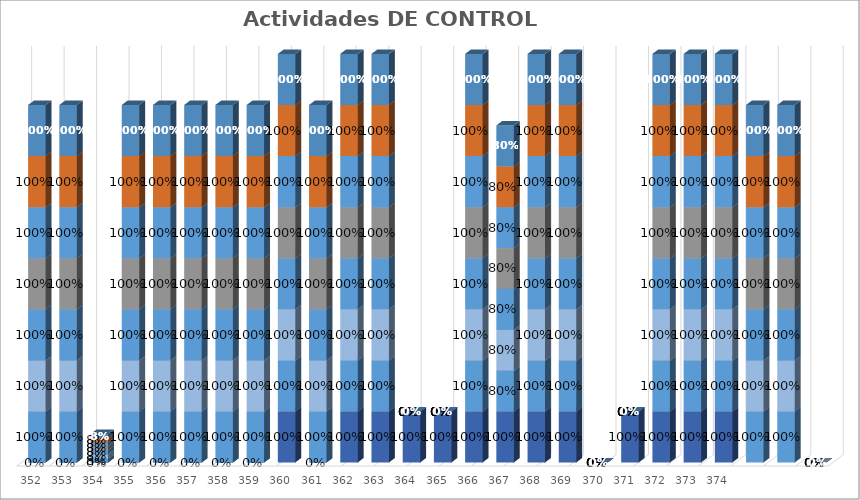
| Category | % Avance |
|---|---|
| 352.0 | 1 |
| 353.0 | 1 |
| 354.0 | 0.08 |
| 355.0 | 1 |
| 356.0 | 1 |
| 357.0 | 1 |
| 358.0 | 1 |
| 359.0 | 1 |
| 360.0 | 1 |
| 361.0 | 1 |
| 362.0 | 1 |
| 363.0 | 1 |
| 364.0 | 0 |
| 365.0 | 0 |
| 366.0 | 1 |
| 367.0 | 0.8 |
| 368.0 | 1 |
| 369.0 | 1 |
| 370.0 | 0 |
| 371.0 | 0 |
| 372.0 | 1 |
| 373.0 | 1 |
| 374.0 | 1 |